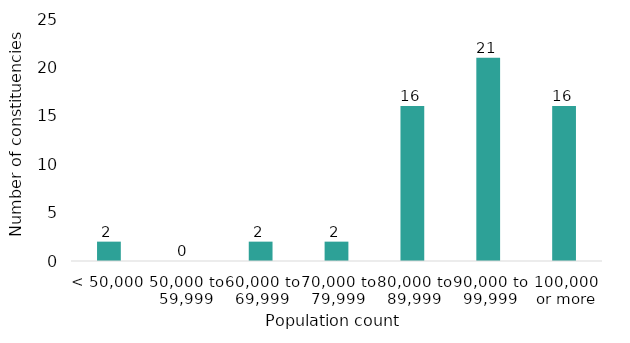
| Category | 2 |
|---|---|
| < 50,000 | 2 |
| 50,000 to 59,999 | 0 |
| 60,000 to 69,999 | 2 |
| 70,000 to 79,999 | 2 |
| 80,000 to 89,999 | 16 |
| 90,000 to 99,999 | 21 |
| 100,000 or more | 16 |